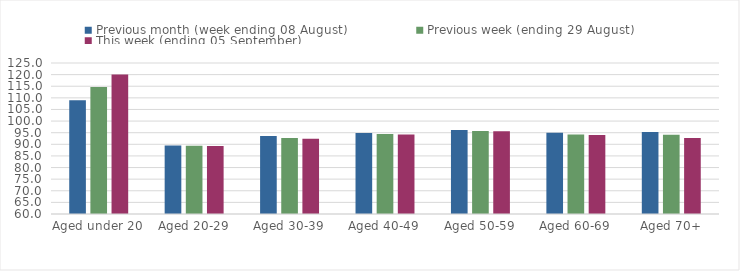
| Category | Previous month (week ending 08 August) | Previous week (ending 29 August) | This week (ending 05 September) |
|---|---|---|---|
| Aged under 20 | 109 | 114.68 | 120 |
| Aged 20-29 | 89.49 | 89.39 | 89.29 |
| Aged 30-39 | 93.53 | 92.71 | 92.41 |
| Aged 40-49 | 94.89 | 94.44 | 94.19 |
| Aged 50-59 | 96.17 | 95.72 | 95.57 |
| Aged 60-69 | 94.96 | 94.23 | 94.06 |
| Aged 70+ | 95.35 | 94.16 | 92.74 |